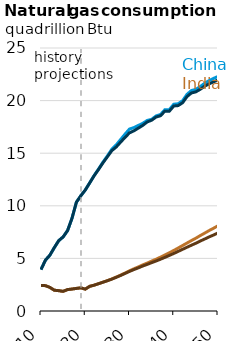
| Category | NG-IIF-CHI | NG-IIF-IND | NG-Ref-CHI | NG-Ref-IND |
|---|---|---|---|---|
| 2010.0 | 3.938 | 2.428 | 3.938 | 2.428 |
| 2011.0 | 4.832 | 2.41 | 4.832 | 2.41 |
| 2012.0 | 5.302 | 2.244 | 5.302 | 2.244 |
| 2013.0 | 6.019 | 1.976 | 6.019 | 1.976 |
| 2014.0 | 6.685 | 1.933 | 6.685 | 1.933 |
| 2015.0 | 7.041 | 1.869 | 7.041 | 1.869 |
| 2016.0 | 7.642 | 2.036 | 7.642 | 2.036 |
| 2017.0 | 8.805 | 2.087 | 8.805 | 2.087 |
| 2018.0 | 10.342 | 2.147 | 10.342 | 2.147 |
| 2019.0 | 10.955 | 2.204 | 10.955 | 2.204 |
| 2020.0 | 11.496 | 2.08 | 11.496 | 2.08 |
| 2021.0 | 12.18 | 2.344 | 12.171 | 2.344 |
| 2022.0 | 12.878 | 2.453 | 12.849 | 2.452 |
| 2023.0 | 13.496 | 2.596 | 13.452 | 2.592 |
| 2024.0 | 14.146 | 2.741 | 14.083 | 2.734 |
| 2025.0 | 14.742 | 2.889 | 14.657 | 2.877 |
| 2026.0 | 15.38 | 3.045 | 15.24 | 3.028 |
| 2027.0 | 15.788 | 3.226 | 15.592 | 3.201 |
| 2028.0 | 16.304 | 3.413 | 16.052 | 3.379 |
| 2029.0 | 16.816 | 3.615 | 16.507 | 3.569 |
| 2030.0 | 17.298 | 3.821 | 16.933 | 3.762 |
| 2031.0 | 17.438 | 4.013 | 17.128 | 3.939 |
| 2032.0 | 17.639 | 4.19 | 17.383 | 4.101 |
| 2033.0 | 17.845 | 4.385 | 17.646 | 4.277 |
| 2034.0 | 18.113 | 4.555 | 17.969 | 4.428 |
| 2035.0 | 18.219 | 4.743 | 18.134 | 4.595 |
| 2036.0 | 18.54 | 4.922 | 18.436 | 4.75 |
| 2037.0 | 18.677 | 5.118 | 18.56 | 4.92 |
| 2038.0 | 19.135 | 5.323 | 18.996 | 5.098 |
| 2039.0 | 19.139 | 5.536 | 18.992 | 5.281 |
| 2040.0 | 19.656 | 5.755 | 19.486 | 5.468 |
| 2041.0 | 19.701 | 5.986 | 19.524 | 5.665 |
| 2042.0 | 19.987 | 6.224 | 19.797 | 5.865 |
| 2043.0 | 20.596 | 6.459 | 20.382 | 6.06 |
| 2044.0 | 20.958 | 6.697 | 20.727 | 6.255 |
| 2045.0 | 21.071 | 6.922 | 20.832 | 6.443 |
| 2046.0 | 21.338 | 7.171 | 21.079 | 6.65 |
| 2047.0 | 21.656 | 7.405 | 21.373 | 6.844 |
| 2048.0 | 21.902 | 7.647 | 21.597 | 7.043 |
| 2049.0 | 22.111 | 7.868 | 21.785 | 7.225 |
| 2050.0 | 22.296 | 8.106 | 21.953 | 7.419 |